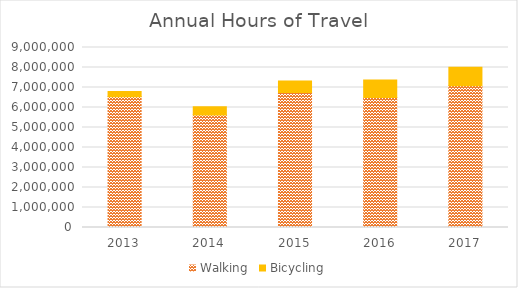
| Category | Walking | Bicycling |
|---|---|---|
| 2013 | 6535915.324 | 264878.137 |
| 2014 | 5630425.437 | 402016.026 |
| 2015 | 6753986.699 | 570545.28 |
| 2016 | 6497459.722 | 872932.315 |
| 2017 | 7091469.431 | 914984.316 |